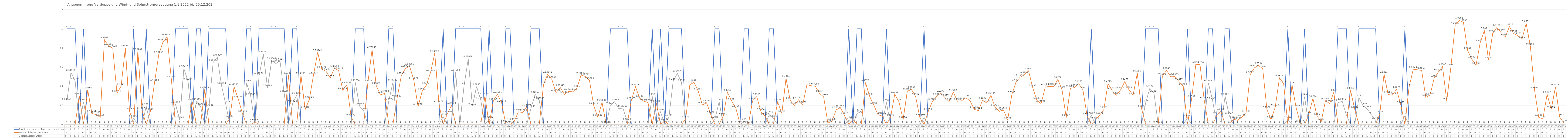
| Category | 1 = Strom reicht im Tagesdurchschnitt aus | Zusätzlich benötigter Strom | Überschüssiger Strom |
|---|---|---|---|
| 0 | 1 | 0 | 0.241 |
| 1 | 1 | 0 | 0.543 |
| 2 | 1 | 0 | 0.455 |
| 3 | 0 | 0.3 | 0 |
| 4 | 1 | 0 | 0.236 |
| 5 | 0 | 0.361 | 0 |
| 6 | 0 | 0.114 | 0 |
| 7 | 0 | 0.103 | 0 |
| 8 | 0 | 0.075 | 0 |
| 9 | 0 | 0.886 | 0 |
| 10 | 0 | 0.819 | 0 |
| 11 | 0 | 0.797 | 0 |
| 12 | 0 | 0.325 | 0 |
| 13 | 0 | 0.402 | 0 |
| 14 | 0 | 0.799 | 0 |
| 15 | 0 | 0.141 | 0 |
| 16 | 1 | 0 | 0.063 |
| 17 | 0 | 0.763 | 0 |
| 18 | 0 | 0.146 | 0 |
| 19 | 1 | 0 | 0.188 |
| 20 | 0 | 0.135 | 0 |
| 21 | 0 | 0.442 | 0 |
| 22 | 0 | 0.732 | 0 |
| 23 | 0 | 0.861 | 0 |
| 24 | 0 | 0.916 | 0 |
| 25 | 0 | 0.475 | 0 |
| 26 | 1 | 0 | 0.213 |
| 27 | 1 | 0 | 0.049 |
| 28 | 1 | 0 | 0.584 |
| 29 | 1 | 0 | 0.452 |
| 30 | 0 | 0.238 | 0 |
| 31 | 1 | 0 | 0.239 |
| 32 | 1 | 0 | 0.187 |
| 33 | 0 | 0.369 | 0 |
| 34 | 1 | 0 | 0.179 |
| 35 | 1 | 0 | 0.648 |
| 36 | 1 | 0 | 0.704 |
| 37 | 1 | 0 | 0.407 |
| 38 | 1 | 0 | 0.216 |
| 39 | 0 | 0.065 | 0 |
| 40 | 0 | 0.395 | 0 |
| 41 | 0 | 0.268 | 0 |
| 42 | 0 | 0.115 | 0 |
| 43 | 1 | 0 | 0.434 |
| 44 | 1 | 0 | 0.291 |
| 45 | 0 | 0.026 | 0 |
| 46 | 1 | 0 | 0.512 |
| 47 | 1 | 0 | 0.737 |
| 48 | 1 | 0 | 0.385 |
| 49 | 1 | 0 | 0.667 |
| 50 | 1 | 0 | 0.637 |
| 51 | 1 | 0 | 0.661 |
| 52 | 1 | 0 | 0.324 |
| 53 | 0 | 0.515 | 0 |
| 54 | 1 | 0 | 0.219 |
| 55 | 1 | 0 | 0.306 |
| 56 | 0 | 0.515 | 0 |
| 57 | 0 | 0.156 | 0 |
| 58 | 0 | 0.261 | 0 |
| 59 | 0 | 0.517 | 0 |
| 60 | 0 | 0.752 | 0 |
| 61 | 0 | 0.578 | 0 |
| 62 | 0 | 0.556 | 0 |
| 63 | 0 | 0.487 | 0 |
| 64 | 0 | 0.586 | 0 |
| 65 | 0 | 0.565 | 0 |
| 66 | 0 | 0.358 | 0 |
| 67 | 0 | 0.415 | 0 |
| 68 | 0 | 0.077 | 0 |
| 69 | 1 | 0 | 0.438 |
| 70 | 1 | 0 | 0.193 |
| 71 | 1 | 0 | 0.143 |
| 72 | 0 | 0.434 | 0 |
| 73 | 0 | 0.782 | 0 |
| 74 | 0 | 0.408 | 0 |
| 75 | 0 | 0.309 | 0 |
| 76 | 0 | 0.325 | 0 |
| 77 | 1 | 0 | 0.245 |
| 78 | 1 | 0 | 0.441 |
| 79 | 0 | 0.276 | 0 |
| 80 | 0 | 0.51 | 0 |
| 81 | 0 | 0.587 | 0 |
| 82 | 0 | 0.608 | 0 |
| 83 | 0 | 0.461 | 0 |
| 84 | 0 | 0.188 | 0 |
| 85 | 0 | 0.349 | 0 |
| 86 | 0 | 0.411 | 0 |
| 87 | 0 | 0.546 | 0 |
| 88 | 0 | 0.743 | 0 |
| 89 | 0 | 0.217 | 0 |
| 90 | 1 | 0 | 0.081 |
| 91 | 0 | 0.11 | 0 |
| 92 | 0 | 0.2 | 0 |
| 93 | 1 | 0 | 0.546 |
| 94 | 1 | 0 | 0.006 |
| 95 | 1 | 0 | 0.402 |
| 96 | 1 | 0 | 0.686 |
| 97 | 1 | 0 | 0.192 |
| 98 | 1 | 0 | 0.396 |
| 99 | 1 | 0 | 0.256 |
| 100 | 0 | 0.297 | 0 |
| 101 | 1 | 0 | 0.055 |
| 102 | 0 | 0.245 | 0 |
| 103 | 0 | 0.316 | 0 |
| 104 | 0 | 0.222 | 0 |
| 105 | 1 | 0 | 0.013 |
| 106 | 1 | 0 | 0.038 |
| 107 | 0 | 0.031 | 0 |
| 108 | 0 | 0.132 | 0 |
| 109 | 0 | 0.125 | 0 |
| 110 | 0 | 0.181 | 0 |
| 111 | 1 | 0 | 0.168 |
| 112 | 1 | 0 | 0.315 |
| 113 | 1 | 0 | 0.25 |
| 114 | 0 | 0.415 | 0 |
| 115 | 0 | 0.525 | 0 |
| 116 | 0 | 0.471 | 0 |
| 117 | 0 | 0.332 | 0 |
| 118 | 0 | 0.386 | 0 |
| 119 | 0 | 0.314 | 0 |
| 120 | 0 | 0.346 | 0 |
| 121 | 0 | 0.341 | 0 |
| 122 | 0 | 0.381 | 0 |
| 123 | 0 | 0.516 | 0 |
| 124 | 0 | 0.502 | 0 |
| 125 | 0 | 0.459 | 0 |
| 126 | 0 | 0.2 | 0 |
| 127 | 0 | 0.073 | 0 |
| 128 | 0 | 0.231 | 0 |
| 129 | 0 | 0 | 0 |
| 130 | 1 | 0 | 0.202 |
| 131 | 1 | 0 | 0.237 |
| 132 | 1 | 0 | 0.164 |
| 133 | 1 | 0 | 0.171 |
| 134 | 1 | 0 | 0.033 |
| 135 | 0 | 0.251 | 0 |
| 136 | 0 | 0.394 | 0 |
| 137 | 0 | 0.275 | 0 |
| 138 | 0 | 0.243 | 0 |
| 139 | 0 | 0.229 | 0 |
| 140 | 1 | 0 | 0.293 |
| 141 | 0 | 0.22 | 0 |
| 142 | 1 | 0 | 0.13 |
| 143 | 0 | 0.035 | 0 |
| 144 | 1 | 0 | 0.076 |
| 145 | 1 | 0 | 0.449 |
| 146 | 1 | 0 | 0.533 |
| 147 | 1 | 0 | 0.442 |
| 148 | 0 | 0.057 | 0 |
| 149 | 0 | 0.416 | 0 |
| 150 | 0 | 0.44 | 0 |
| 151 | 0 | 0.348 | 0 |
| 152 | 0 | 0.205 | 0 |
| 153 | 0 | 0.227 | 0 |
| 154 | 0 | 0.104 | 0 |
| 155 | 1 | 0 | 0.054 |
| 156 | 1 | 0 | 0.237 |
| 157 | 0 | 0.088 | 0 |
| 158 | 0 | 0.337 | 0 |
| 159 | 0 | 0.245 | 0 |
| 160 | 0 | 0.171 | 0 |
| 161 | 0 | 0.007 | 0 |
| 162 | 1 | 0 | 0.03 |
| 163 | 1 | 0 | 0.004 |
| 164 | 0 | 0.247 | 0 |
| 165 | 0 | 0.292 | 0 |
| 166 | 0 | 0.134 | 0 |
| 167 | 0 | 0.087 | 0 |
| 168 | 1 | 0 | 0.102 |
| 169 | 1 | 0 | 0.064 |
| 170 | 0 | 0.235 | 0 |
| 171 | 0 | 0.116 | 0 |
| 172 | 0 | 0.481 | 0 |
| 173 | 0 | 0.252 | 0 |
| 174 | 0 | 0.2 | 0 |
| 175 | 0 | 0.257 | 0 |
| 176 | 0 | 0.208 | 0 |
| 177 | 0 | 0.416 | 0 |
| 178 | 0 | 0.405 | 0 |
| 179 | 0 | 0.4 | 0 |
| 180 | 0 | 0.325 | 0 |
| 181 | 0 | 0.289 | 0 |
| 182 | 0 | 0.015 | 0 |
| 183 | 0 | 0.034 | 0 |
| 184 | 0 | 0.154 | 0 |
| 185 | 0 | 0.175 | 0 |
| 186 | 0 | 0.093 | 0 |
| 187 | 1 | 0 | 0.046 |
| 188 | 0 | 0.053 | 0 |
| 189 | 1 | 0 | 0.115 |
| 190 | 1 | 0 | 0.133 |
| 191 | 0 | 0.438 | 0 |
| 192 | 0 | 0.294 | 0 |
| 193 | 0 | 0.201 | 0 |
| 194 | 0 | 0.102 | 0 |
| 195 | 0 | 0.088 | 0 |
| 196 | 1 | 0 | 0.23 |
| 197 | 0 | 0.073 | 0 |
| 198 | 0 | 0.316 | 0 |
| 199 | 0 | 0.238 | 0 |
| 200 | 0 | 0.051 | 0 |
| 201 | 0 | 0.347 | 0 |
| 202 | 0 | 0.366 | 0 |
| 203 | 0 | 0.291 | 0 |
| 204 | 0 | 0.071 | 0 |
| 205 | 1 | 0 | 0.071 |
| 206 | 0 | 0.135 | 0 |
| 207 | 0 | 0.24 | 0 |
| 208 | 0 | 0.292 | 0 |
| 209 | 0 | 0.328 | 0 |
| 210 | 0 | 0.282 | 0 |
| 211 | 0 | 0.239 | 0 |
| 212 | 0 | 0.338 | 0 |
| 213 | 0 | 0.243 | 0 |
| 214 | 0 | 0.248 | 0 |
| 215 | 0 | 0.278 | 0 |
| 216 | 0 | 0.247 | 0 |
| 217 | 0 | 0.159 | 0 |
| 218 | 0 | 0.144 | 0 |
| 219 | 0 | 0.253 | 0 |
| 220 | 0 | 0.225 | 0 |
| 221 | 0 | 0.305 | 0 |
| 222 | 0 | 0.18 | 0 |
| 223 | 0 | 0.137 | 0 |
| 224 | 0 | 0.151 | 0 |
| 225 | 0 | 0.047 | 0 |
| 226 | 0 | 0.311 | 0 |
| 227 | 0 | 0.444 | 0 |
| 228 | 0 | 0.495 | 0 |
| 229 | 0 | 0.52 | 0 |
| 230 | 0 | 0.56 | 0 |
| 231 | 0 | 0.383 | 0 |
| 232 | 0 | 0.252 | 0 |
| 233 | 0 | 0.218 | 0 |
| 234 | 0 | 0.391 | 0 |
| 235 | 0 | 0.399 | 0 |
| 236 | 0 | 0.394 | 0 |
| 237 | 0 | 0.471 | 0 |
| 238 | 0 | 0.366 | 0 |
| 239 | 0 | 0.073 | 0 |
| 240 | 0 | 0.378 | 0 |
| 241 | 0 | 0.386 | 0 |
| 242 | 0 | 0.426 | 0 |
| 243 | 0 | 0.363 | 0 |
| 244 | 0 | 0.088 | 0 |
| 245 | 1 | 0 | 0.097 |
| 246 | 0 | 0.046 | 0 |
| 247 | 0 | 0.097 | 0 |
| 248 | 0 | 0.155 | 0 |
| 249 | 0 | 0.428 | 0 |
| 250 | 0 | 0.353 | 0 |
| 251 | 0 | 0.305 | 0 |
| 252 | 0 | 0.361 | 0 |
| 253 | 0 | 0.448 | 0 |
| 254 | 0 | 0.363 | 0 |
| 255 | 0 | 0.307 | 0 |
| 256 | 0 | 0.535 | 0 |
| 257 | 0 | 0.169 | 0 |
| 258 | 1 | 0 | 0.225 |
| 259 | 1 | 0 | 0.377 |
| 260 | 1 | 0 | 0.326 |
| 261 | 1 | 0 | 0.003 |
| 262 | 0 | 0.505 | 0 |
| 263 | 0 | 0.565 | 0 |
| 264 | 0 | 0.499 | 0 |
| 265 | 0 | 0.5 | 0 |
| 266 | 0 | 0.448 | 0 |
| 267 | 0 | 0.397 | 0 |
| 268 | 1 | 0 | 0.069 |
| 269 | 0 | 0.271 | 0 |
| 270 | 0 | 0.629 | 0 |
| 271 | 0 | 0.626 | 0 |
| 272 | 0 | 0.257 | 0 |
| 273 | 1 | 0 | 0.434 |
| 274 | 1 | 0 | 0.254 |
| 275 | 0 | 0.092 | 0 |
| 276 | 0 | 0.138 | 0 |
| 277 | 1 | 0 | 0.292 |
| 278 | 1 | 0 | 0.094 |
| 279 | 0 | 0.056 | 0 |
| 280 | 0 | 0.043 | 0 |
| 281 | 0 | 0.077 | 0 |
| 282 | 0 | 0.115 | 0 |
| 283 | 0 | 0.521 | 0 |
| 284 | 0 | 0.592 | 0 |
| 285 | 0 | 0.616 | 0 |
| 286 | 0 | 0.582 | 0 |
| 287 | 0 | 0.156 | 0 |
| 288 | 0 | 0.051 | 0 |
| 289 | 0 | 0.183 | 0 |
| 290 | 0 | 0.487 | 0 |
| 291 | 0 | 0.425 | 0 |
| 292 | 1 | 0 | 0.05 |
| 293 | 0 | 0.414 | 0 |
| 294 | 0 | 0.172 | 0 |
| 295 | 0 | 0.011 | 0 |
| 296 | 1 | 0 | 0.291 |
| 297 | 0 | 0.099 | 0 |
| 298 | 0 | 0.272 | 0 |
| 299 | 0 | 0.085 | 0 |
| 300 | 0 | 0.033 | 0 |
| 301 | 0 | 0.248 | 0 |
| 302 | 0 | 0.219 | 0 |
| 303 | 0 | 0.337 | 0 |
| 304 | 1 | 0 | 0.229 |
| 305 | 1 | 0 | 0.242 |
| 306 | 1 | 0 | 0.099 |
| 307 | 0 | 0.356 | 0 |
| 308 | 0 | 0.159 | 0 |
| 309 | 1 | 0 | 0.279 |
| 310 | 1 | 0 | 0.195 |
| 311 | 1 | 0 | 0.161 |
| 312 | 1 | 0 | 0.1 |
| 313 | 1 | 0 | 0.044 |
| 314 | 0 | 0.111 | 0 |
| 315 | 0 | 0.526 | 0 |
| 316 | 0 | 0.312 | 0 |
| 317 | 0 | 0.307 | 0 |
| 318 | 0 | 0.367 | 0 |
| 319 | 0 | 0.208 | 0 |
| 320 | 1 | 0 | 0.089 |
| 321 | 0 | 0.393 | 0 |
| 322 | 0 | 0.578 | 0 |
| 323 | 0 | 0.572 | 0 |
| 324 | 0 | 0.565 | 0 |
| 325 | 0 | 0.283 | 0 |
| 326 | 0 | 0.307 | 0 |
| 327 | 0 | 0.483 | 0 |
| 328 | 0 | 0.548 | 0 |
| 329 | 0 | 0.605 | 0 |
| 330 | 0 | 0.247 | 0 |
| 331 | 0 | 0.601 | 0 |
| 332 | 0 | 1.033 | 0 |
| 333 | 0 | 1.089 | 0 |
| 334 | 0 | 1.066 | 0 |
| 335 | 0 | 0.774 | 0 |
| 336 | 0 | 0.684 | 0 |
| 337 | 0 | 0.617 | 0 |
| 338 | 0 | 0.854 | 0 |
| 339 | 0 | 0.982 | 0 |
| 340 | 0 | 0.675 | 0 |
| 341 | 0 | 0.953 | 0 |
| 342 | 0 | 1.014 | 0 |
| 343 | 0 | 0.961 | 0 |
| 344 | 0 | 0.916 | 0 |
| 345 | 0 | 1.022 | 0 |
| 346 | 0 | 0.95 | 0 |
| 347 | 0 | 0.928 | 0 |
| 348 | 0 | 0.891 | 0 |
| 349 | 0 | 1.055 | 0 |
| 350 | 0 | 0.817 | 0 |
| 351 | 0 | 0.359 | 0 |
| 352 | 0 | 0.075 | 0 |
| 353 | 0 | 0.059 | 0 |
| 354 | 0 | 0.315 | 0 |
| 355 | 0 | 0.159 | 0 |
| 356 | 0 | 0.393 | 0 |
| 357 | 0 | 0.079 | 0 |
| 358 | 0 | 0.016 | 0 |